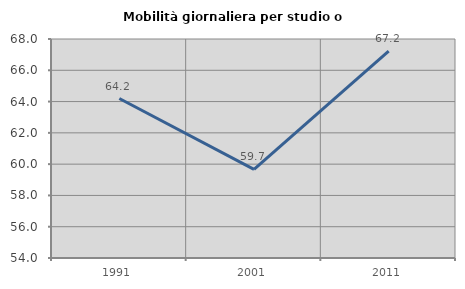
| Category | Mobilità giornaliera per studio o lavoro |
|---|---|
| 1991.0 | 64.194 |
| 2001.0 | 59.661 |
| 2011.0 | 67.219 |